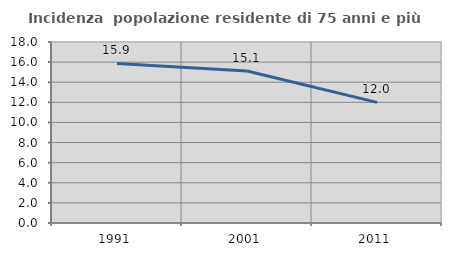
| Category | Incidenza  popolazione residente di 75 anni e più |
|---|---|
| 1991.0 | 15.865 |
| 2001.0 | 15.122 |
| 2011.0 | 12 |